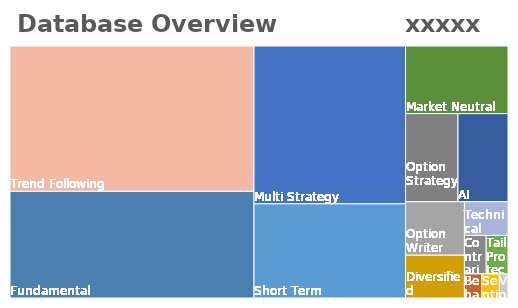
| Category | Avg YTD |
|---|---|
| AssetAllocation | 0.035 |
| Crypto | 0.453 |
| CTA | 0.039 |
| Equity LS | 0.045 |
| Event Driven | 0.014 |
| Fixed Income | 0.022 |
| Hedge Fund | 0.028 |
| Infrastructure | -0.057 |
| LongOnly | 0.036 |
| Market Neutral | 0.034 |
| NilssonHedge Index | 0.065 |
| Private Debt | 0.017 |
| Private Equity | -0.035 |
| RiskPremia | 0.037 |